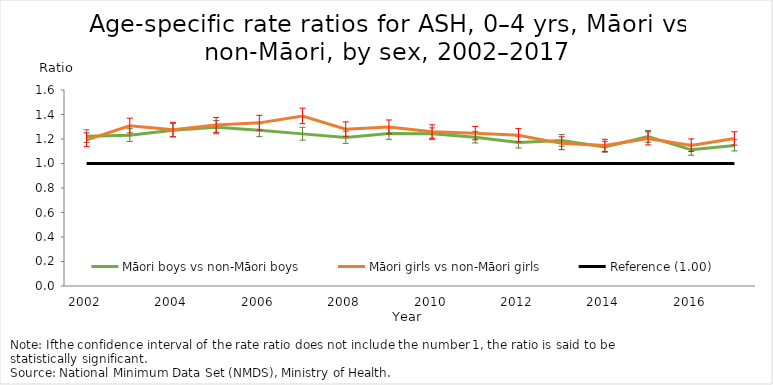
| Category | Māori boys vs non-Māori boys | Māori girls vs non-Māori girls | Reference (1.00) |
|---|---|---|---|
| 2002.0 | 1.222 | 1.193 | 1 |
| 2003.0 | 1.231 | 1.308 | 1 |
| 2004.0 | 1.272 | 1.275 | 1 |
| 2005.0 | 1.295 | 1.314 | 1 |
| 2006.0 | 1.271 | 1.332 | 1 |
| 2007.0 | 1.242 | 1.387 | 1 |
| 2008.0 | 1.213 | 1.28 | 1 |
| 2009.0 | 1.245 | 1.298 | 1 |
| 2010.0 | 1.242 | 1.259 | 1 |
| 2011.0 | 1.214 | 1.247 | 1 |
| 2012.0 | 1.171 | 1.23 | 1 |
| 2013.0 | 1.188 | 1.164 | 1 |
| 2014.0 | 1.135 | 1.147 | 1 |
| 2015.0 | 1.22 | 1.203 | 1 |
| 2016.0 | 1.112 | 1.148 | 1 |
| 2017.0 | 1.148 | 1.203 | 1 |